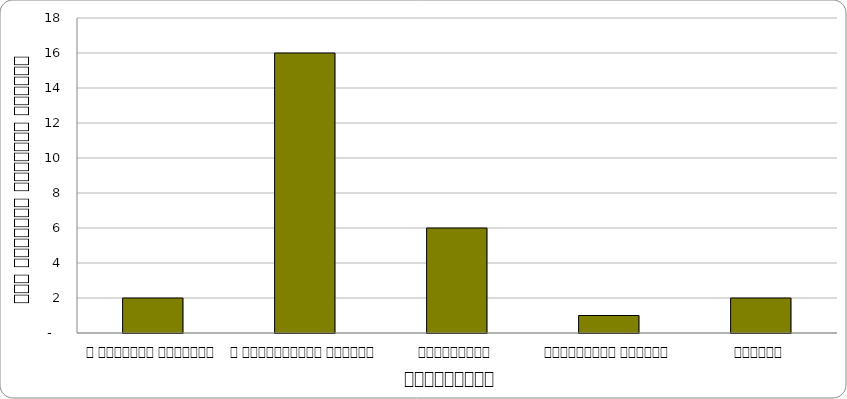
| Category | स्वास्थ्य  |
|---|---|
| द हिमालयन टाइम्स् | 2 |
| द काठमाण्डौं पोस्ट् | 16 |
| कान्तिपुर | 6 |
| अन्नपूर्ण पोस्ट् | 1 |
| नागरिक | 2 |